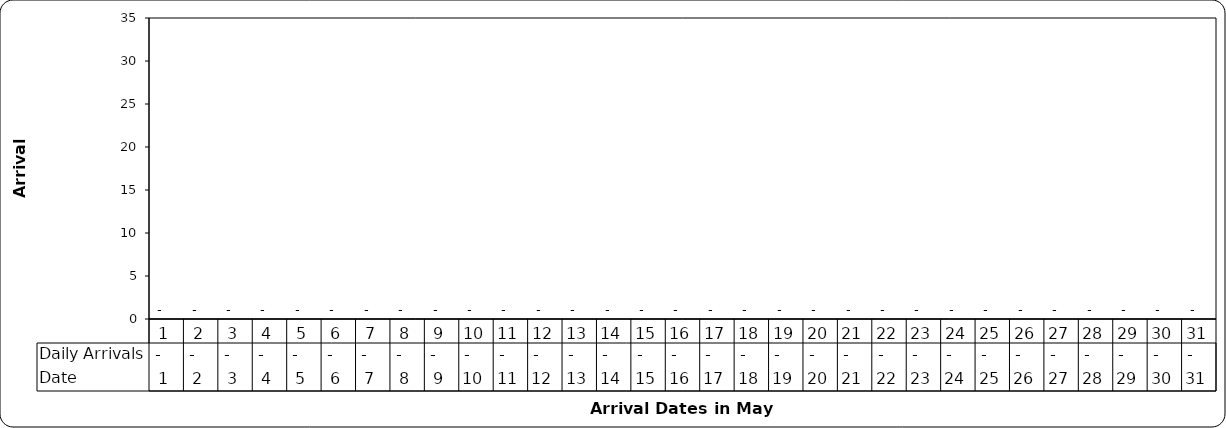
| Category | Daily Arrivals |
|---|---|
| 0 | 0 |
| 1 | 0 |
| 2 | 0 |
| 3 | 0 |
| 4 | 0 |
| 5 | 0 |
| 6 | 0 |
| 7 | 0 |
| 8 | 0 |
| 9 | 0 |
| 10 | 0 |
| 11 | 0 |
| 12 | 0 |
| 13 | 0 |
| 14 | 0 |
| 15 | 0 |
| 16 | 0 |
| 17 | 0 |
| 18 | 0 |
| 19 | 0 |
| 20 | 0 |
| 21 | 0 |
| 22 | 0 |
| 23 | 0 |
| 24 | 0 |
| 25 | 0 |
| 26 | 0 |
| 27 | 0 |
| 28 | 0 |
| 29 | 0 |
| 30 | 0 |